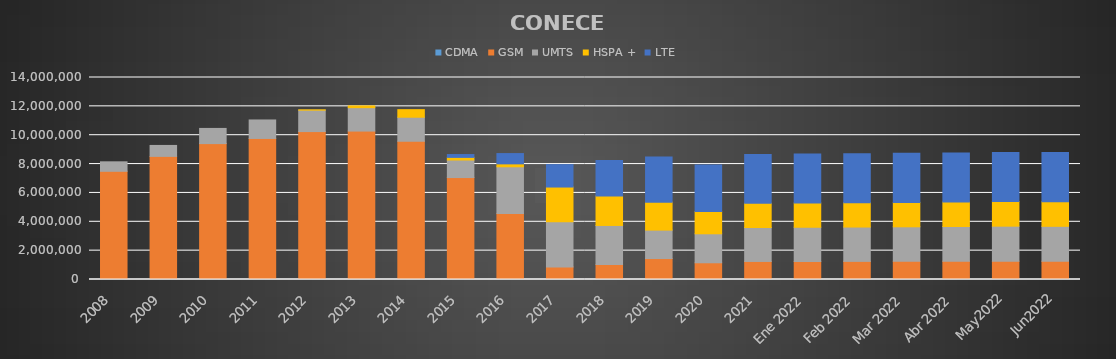
| Category | CDMA | GSM | UMTS | HSPA + | LTE |
|---|---|---|---|---|---|
| 2008 | 0 | 7499370 | 656989 | 0 | 0 |
| 2009 | 0 | 8532691 | 758577 | 0 | 0 |
| 2010 | 0 | 9419193 | 1051309 | 0 | 0 |
| 2011 | 0 | 9774865 | 1282451 | 0 | 0 |
| 2012 | 0 | 10252457 | 1484003 | 21446 | 0 |
| 2013 | 0 | 10287259 | 1622034 | 121593 | 0 |
| 2014 | 0 | 9581956 | 1664758 | 525306 | 0 |
| 2015 | 0 | 7065313 | 1214567 | 183109 | 195630 |
| 2016 | 0 | 4571999 | 3240700 | 201567 | 712557 |
| 2017 | 0 | 873346 | 3135577 | 2399460 | 1551880 |
| 2018 | 0 | 1039373 | 2706058 | 2049418 | 2453201 |
| 2019 | 0 | 1452334 | 1970422 | 1937931 | 3132367 |
| 2020 | 0 | 1158751 | 2009264 | 1548440 | 3212798 |
| 2021 | 0 | 1250925 | 2353798 | 1675346 | 3385646 |
| Ene 2022 | 0 | 1253803 | 2367204 | 1682872 | 3391452 |
| Feb 2022 | 0 | 1256245 | 2379435 | 1688963 | 3397299 |
| Mar 2022 | 0 | 1259631 | 2392596 | 1693034 | 3401696 |
| Abr 2022 | 0 | 1264438 | 2406911 | 1697322 | 3404685 |
| May2022 | 0 | 1270140 | 2426173 | 1703122 | 3410983 |
| Jun2022 | 0 | 1262085 | 2423097 | 1704279 | 3412930 |